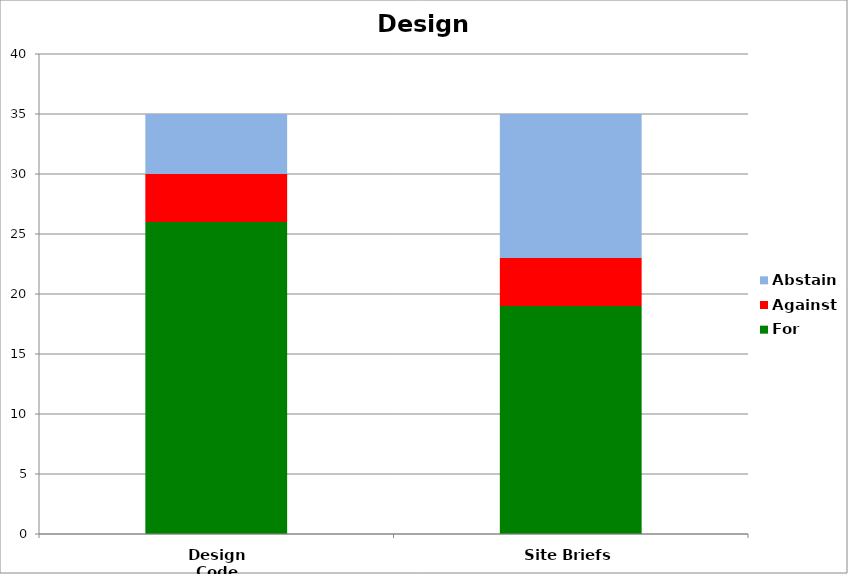
| Category | For | Against | Abstain |
|---|---|---|---|
| Design Code | 26 | 4 | 5 |
| Site Briefs | 19 | 4 | 12 |